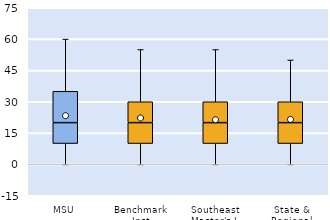
| Category | 25th | 50th | 75th |
|---|---|---|---|
| MSU | 10 | 10 | 15 |
| Benchmark Inst | 10 | 10 | 10 |
| Southeast Master's-L | 10 | 10 | 10 |
| State & Regional | 10 | 10 | 10 |